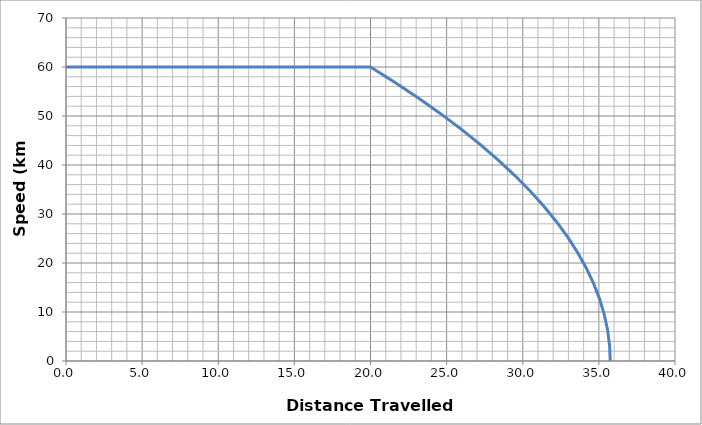
| Category | Series 0 |
|---|---|
| 0.0 | 60 |
| 20.0 | 60 |
| 21.61396250302727 | 56.842 |
| 23.14068378967469 | 53.684 |
| 24.580163859942253 | 50.526 |
| 25.932402713829966 | 47.368 |
| 27.197400351337826 | 44.211 |
| 28.375156772465836 | 41.053 |
| 29.46567197721399 | 37.895 |
| 30.468945965582293 | 34.737 |
| 31.384978737570744 | 31.579 |
| 32.213770293179344 | 28.421 |
| 32.95532063240809 | 25.263 |
| 33.60962975525698 | 22.105 |
| 34.176697661726024 | 18.947 |
| 34.656524351815214 | 15.789 |
| 35.04910982552455 | 12.632 |
| 35.35445408285403 | 9.474 |
| 35.57255712380366 | 6.316 |
| 35.70341894837344 | 3.158 |
| 35.747039556563365 | 0 |